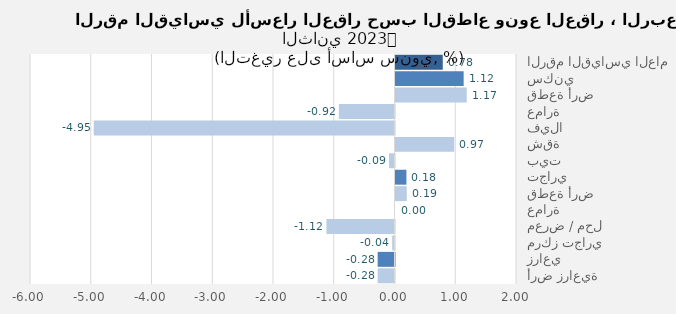
| Category | Series 0 |
|---|---|
| الرقم القياسي العام | 0.778 |
| سكني | 1.122 |
| قطعة أرض | 1.173 |
| عمارة | -0.916 |
| فيلا | -4.951 |
| شقة | 0.966 |
| بيت | -0.09 |
| تجاري | 0.18 |
| قطعة أرض | 0.186 |
| عمارة | 0 |
| معرض / محل | -1.12 |
| مركز تجاري | -0.038 |
| زراعي | -0.277 |
| أرض زراعية | -0.277 |